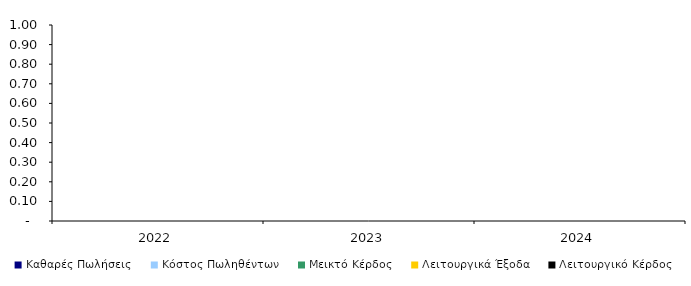
| Category | Καθαρές Πωλήσεις | Κόστος Πωληθέντων | Μεικτό Κέρδος | Λειτουργικά Έξοδα | Λειτουργικό Κέρδος |
|---|---|---|---|---|---|
| 2022.0 | 0 | 0 | 0 | 0 | 0 |
| 2023.0 | 0 | 0 | 0 | 0 | 0 |
| 2024.0 | 0 | 0 | 0 | 0 | 0 |